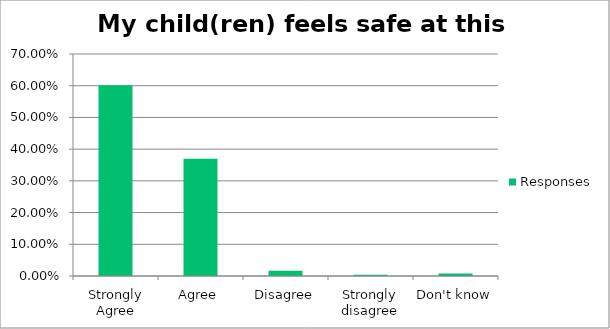
| Category | Responses |
|---|---|
| Strongly Agree | 0.602 |
| Agree | 0.37 |
| Disagree | 0.016 |
| Strongly disagree | 0.004 |
| Don't know | 0.008 |